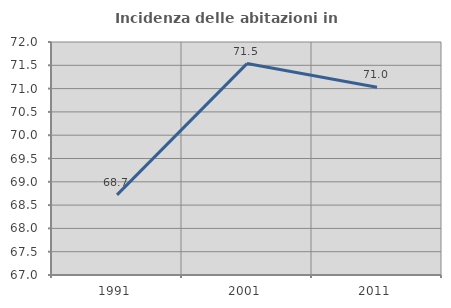
| Category | Incidenza delle abitazioni in proprietà  |
|---|---|
| 1991.0 | 68.72 |
| 2001.0 | 71.537 |
| 2011.0 | 71.029 |